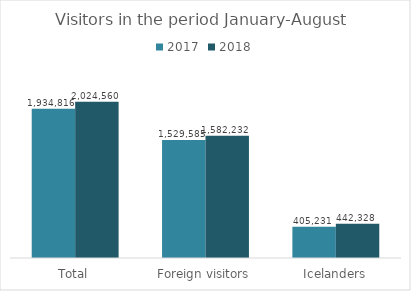
| Category | 2017 | 2018 |
|---|---|---|
| Total | 1934816 | 2024560 |
| Foreign visitors | 1529585 | 1582232 |
| Icelanders | 405231 | 442328 |